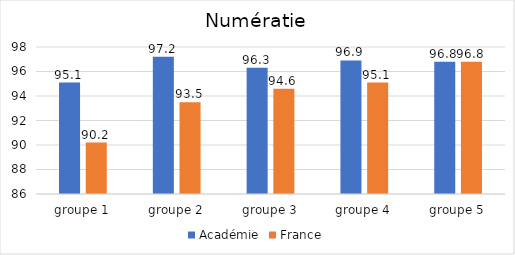
| Category | Académie | France |
|---|---|---|
| groupe 1 | 95.1 | 90.2 |
| groupe 2 | 97.2 | 93.5 |
| groupe 3 | 96.3 | 94.6 |
| groupe 4 | 96.9 | 95.1 |
| groupe 5 | 96.8 | 96.8 |